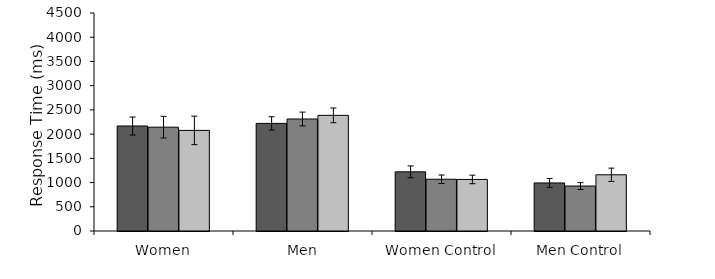
| Category | Dressed | Blurred | Naked |
|---|---|---|---|
| Women | 2167.468 | 2143.2 | 2076.569 |
|  Men | 2221.004 | 2312.044 | 2387.083 |
| Women Control | 1220.926 | 1068.53 | 1064.484 |
| Men Control | 991.864 | 928.162 | 1159.94 |